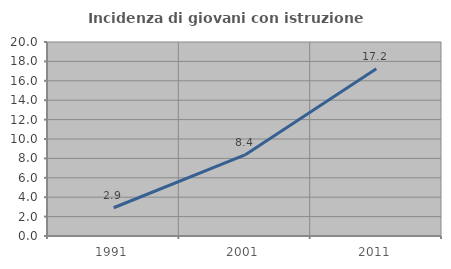
| Category | Incidenza di giovani con istruzione universitaria |
|---|---|
| 1991.0 | 2.913 |
| 2001.0 | 8.362 |
| 2011.0 | 17.234 |